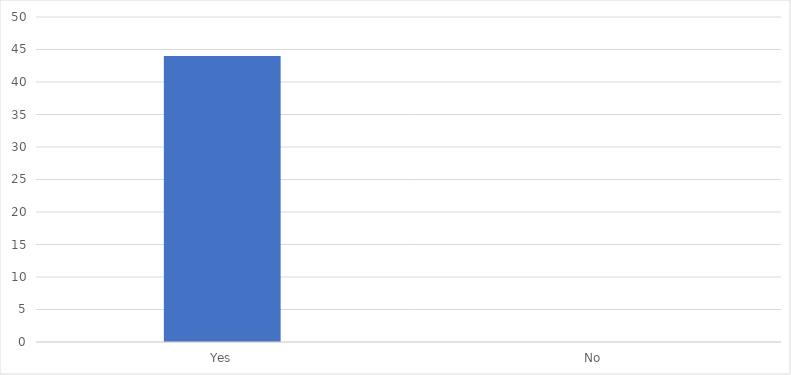
| Category | Number of Responses |
|---|---|
| Yes | 44 |
| No | 0 |